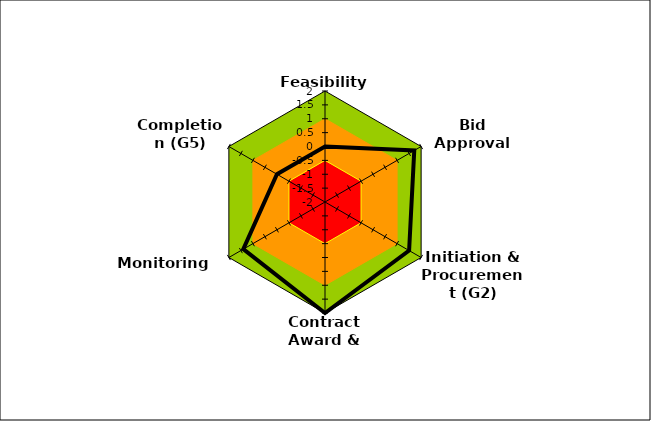
| Category | Series 0 | Series 1 | Series 2 | Series 3 | Series 4 |
|---|---|---|---|---|---|
| Feasibility (G0) | 2 | 1 | -0.5 | -2 | 0 |
| Bid Approval (G1) | 2 | 1 | -0.5 | -2 | 1.714 |
| Initiation & Procurement (G2) | 2 | 1 | -0.5 | -2 | 1.5 |
| Contract Award & Delivery (G3) | 2 | 1 | -0.5 | -2 | 2 |
| Monitoring (G4) | 2 | 1 | -0.5 | -2 | 1.4 |
| Completion (G5) | 2 | 1 | -0.5 | -2 | 0 |